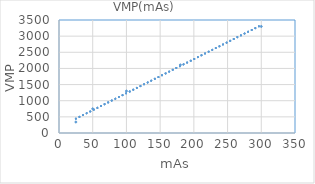
| Category | VMP(mAs) |
|---|---|
| 25.0 | 340 |
| 50.0 | 750 |
| 100.0 | 1300 |
| 180.0 | 2110 |
| 300.0 | 3300 |